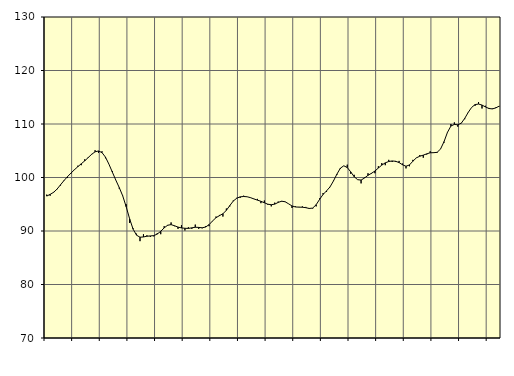
| Category | Piggar | Samtliga fast anställda (inkl. fast anställda utomlands) |
|---|---|---|
| nan | 96.8 | 96.53 |
| 87.0 | 96.6 | 96.85 |
| 87.0 | 97.3 | 97.23 |
| 87.0 | 97.8 | 97.84 |
| nan | 98.5 | 98.64 |
| 88.0 | 99.5 | 99.43 |
| 88.0 | 99.9 | 100.15 |
| 88.0 | 100.7 | 100.82 |
| nan | 101.5 | 101.44 |
| 89.0 | 102.2 | 102.02 |
| 89.0 | 102.3 | 102.57 |
| 89.0 | 103.4 | 103.11 |
| nan | 103.8 | 103.72 |
| 90.0 | 104.4 | 104.33 |
| 90.0 | 105.1 | 104.8 |
| 90.0 | 104.6 | 104.96 |
| nan | 104.9 | 104.65 |
| 91.0 | 103.6 | 103.81 |
| 91.0 | 102.5 | 102.5 |
| 91.0 | 101.2 | 101 |
| nan | 99.5 | 99.51 |
| 92.0 | 97.9 | 98.11 |
| 92.0 | 96.6 | 96.56 |
| 92.0 | 95 | 94.54 |
| nan | 91.5 | 92.28 |
| 93.0 | 90.5 | 90.35 |
| 93.0 | 89.5 | 89.22 |
| 93.0 | 88.1 | 88.84 |
| nan | 89.4 | 88.89 |
| 94.0 | 89.2 | 89.02 |
| 94.0 | 88.9 | 89.08 |
| 94.0 | 89 | 89.14 |
| nan | 89.6 | 89.43 |
| 95.0 | 89.4 | 89.95 |
| 95.0 | 90.9 | 90.58 |
| 95.0 | 91 | 91.08 |
| nan | 91.6 | 91.19 |
| 96.0 | 90.9 | 90.98 |
| 96.0 | 90.4 | 90.73 |
| 96.0 | 91.1 | 90.58 |
| nan | 90.1 | 90.51 |
| 97.0 | 90.7 | 90.48 |
| 97.0 | 90.4 | 90.59 |
| 97.0 | 91.2 | 90.7 |
| nan | 90.4 | 90.67 |
| 98.0 | 90.5 | 90.6 |
| 98.0 | 90.9 | 90.74 |
| 98.0 | 90.9 | 91.19 |
| nan | 91.9 | 91.87 |
| 99.0 | 92.7 | 92.49 |
| 99.0 | 93 | 92.87 |
| 99.0 | 92.7 | 93.23 |
| nan | 94.2 | 93.86 |
| 0.0 | 94.6 | 94.76 |
| 0.0 | 95.7 | 95.6 |
| 0.0 | 96.2 | 96.12 |
| nan | 96.2 | 96.39 |
| 1.0 | 96.6 | 96.45 |
| 1.0 | 96.4 | 96.4 |
| 1.0 | 96.2 | 96.23 |
| nan | 96 | 95.99 |
| 2.0 | 96 | 95.77 |
| 2.0 | 95.2 | 95.55 |
| 2.0 | 95.7 | 95.28 |
| nan | 94.9 | 95.01 |
| 3.0 | 94.6 | 94.91 |
| 3.0 | 95.3 | 95.02 |
| 3.0 | 95.5 | 95.34 |
| nan | 95.5 | 95.57 |
| 4.0 | 95.5 | 95.47 |
| 4.0 | 95.1 | 95.09 |
| 4.0 | 94.3 | 94.68 |
| nan | 94.6 | 94.49 |
| 5.0 | 94.5 | 94.46 |
| 5.0 | 94.6 | 94.44 |
| 5.0 | 94.5 | 94.36 |
| nan | 94.3 | 94.21 |
| 6.0 | 94.2 | 94.29 |
| 6.0 | 94.6 | 94.92 |
| 6.0 | 96.1 | 95.92 |
| nan | 97.1 | 96.83 |
| 7.0 | 97.3 | 97.5 |
| 7.0 | 98.2 | 98.24 |
| 7.0 | 99.4 | 99.35 |
| nan | 100.5 | 100.63 |
| 8.0 | 101.6 | 101.74 |
| 8.0 | 102.2 | 102.19 |
| 8.0 | 102.4 | 101.86 |
| nan | 100.7 | 101.05 |
| 9.0 | 100.5 | 100.15 |
| 9.0 | 99.6 | 99.59 |
| 9.0 | 98.9 | 99.52 |
| nan | 100 | 99.91 |
| 10.0 | 100.8 | 100.41 |
| 10.0 | 100.7 | 100.78 |
| 10.0 | 100.8 | 101.21 |
| nan | 102.1 | 101.77 |
| 11.0 | 102.7 | 102.32 |
| 11.0 | 102.3 | 102.74 |
| 11.0 | 103.3 | 102.99 |
| nan | 102.9 | 103.09 |
| 12.0 | 102.9 | 103.03 |
| 12.0 | 103.1 | 102.79 |
| 12.0 | 102.6 | 102.38 |
| nan | 101.7 | 102.1 |
| 13.0 | 102.1 | 102.35 |
| 13.0 | 103.3 | 103.05 |
| 13.0 | 103.7 | 103.67 |
| nan | 104.2 | 103.98 |
| 14.0 | 103.7 | 104.18 |
| 14.0 | 104.3 | 104.42 |
| 14.0 | 104.9 | 104.62 |
| nan | 104.7 | 104.64 |
| 15.0 | 104.6 | 104.7 |
| 15.0 | 105.3 | 105.32 |
| 15.0 | 106.5 | 106.69 |
| nan | 108.5 | 108.44 |
| 16.0 | 110 | 109.62 |
| 16.0 | 110.3 | 109.92 |
| 16.0 | 109.5 | 109.85 |
| nan | 110.2 | 110.15 |
| 17.0 | 110.9 | 111.05 |
| 17.0 | 112.2 | 112.16 |
| 17.0 | 113.1 | 113.1 |
| nan | 113.4 | 113.63 |
| 18.0 | 114.1 | 113.73 |
| 18.0 | 112.9 | 113.54 |
| 18.0 | 113.4 | 113.19 |
| nan | 113 | 112.9 |
| 19.0 | 112.9 | 112.82 |
| 19.0 | 113.1 | 113.01 |
| 19.0 | 113.3 | 113.35 |